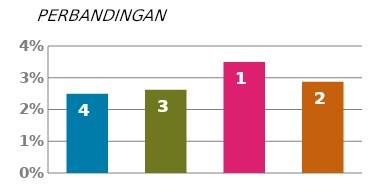
| Category | SUKUBUNGA |
|---|---|
| 0 | 0.025 |
| 1 | 0.026 |
| 2 | 0.035 |
| 3 | 0.029 |